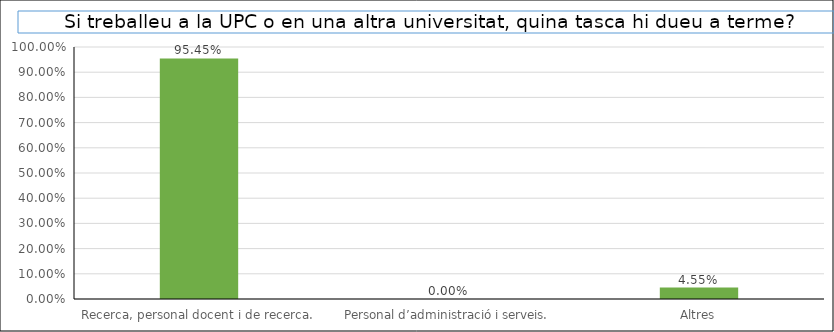
| Category | Series 0 |
|---|---|
| Recerca, personal docent i de recerca. | 0.955 |
| Personal d’administració i serveis. | 0 |
| Altres | 0.045 |